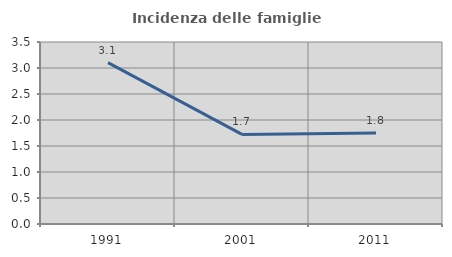
| Category | Incidenza delle famiglie numerose |
|---|---|
| 1991.0 | 3.105 |
| 2001.0 | 1.722 |
| 2011.0 | 1.751 |